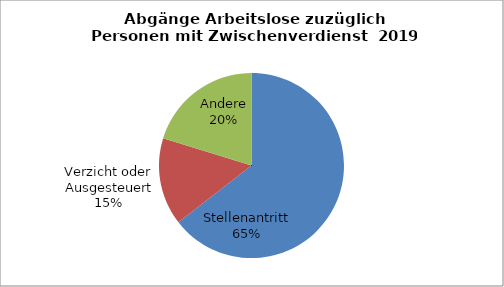
| Category | Series 0 |
|---|---|
| Stellenantritt | 0.645 |
| Verzicht oder Ausgesteuert | 0.153 |
| Andere | 0.202 |